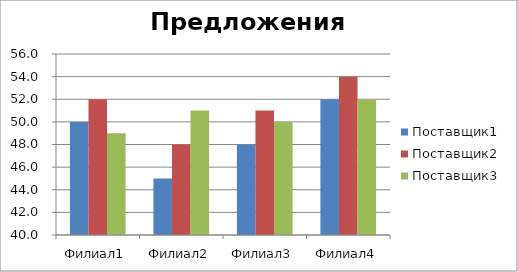
| Category | Поставщик1 | Поставщик2 | Поставщик3 |
|---|---|---|---|
| Филиал1 | 50 | 52 | 49 |
| Филиал2 | 45 | 48 | 51 |
| Филиал3 | 48 | 51 | 50 |
| Филиал4 | 52 | 54 | 52 |